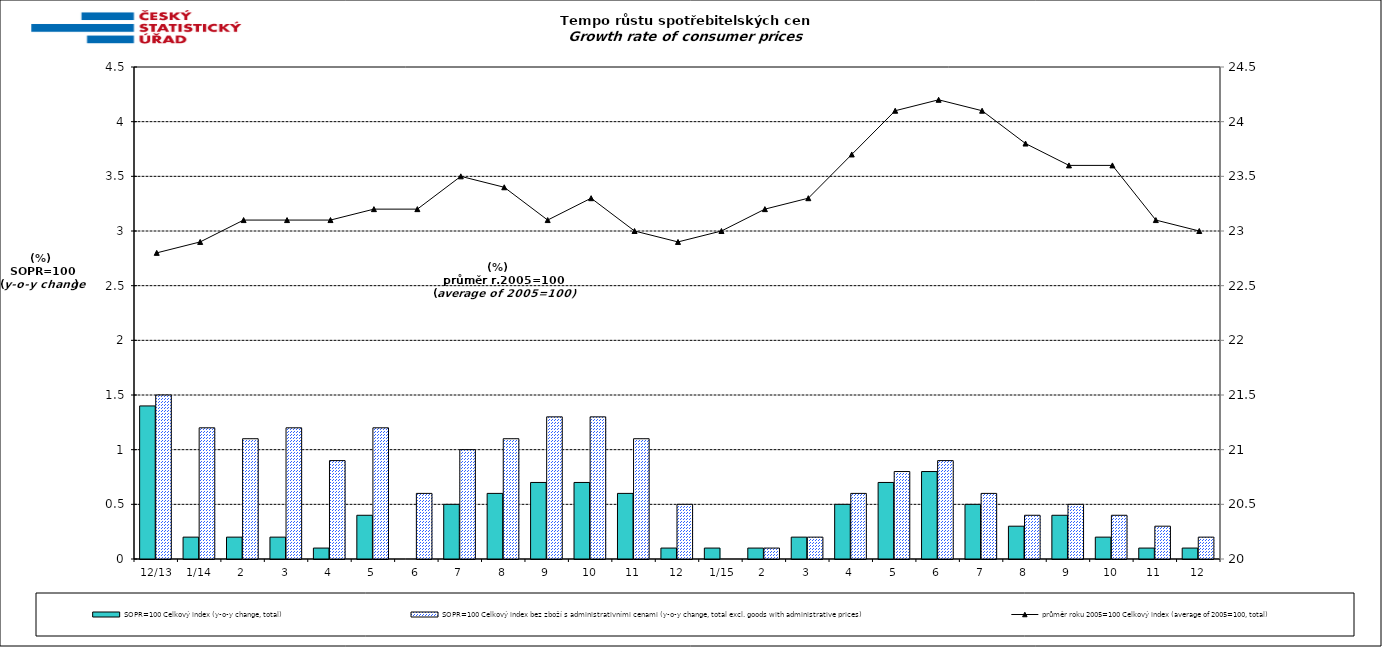
| Category | SOPR=100 Celkový index (y-o-y change, total) | SOPR=100 Celkový index bez zboží s administrativními cenami (y-o-y change, total excl. goods with administrative prices)  |
|---|---|---|
|  12/13 | 1.4 | 1.5 |
| 1/14 | 0.2 | 1.2 |
| 2 | 0.2 | 1.1 |
| 3 | 0.2 | 1.2 |
| 4 | 0.1 | 0.9 |
| 5 | 0.4 | 1.2 |
| 6 | 0 | 0.6 |
| 7 | 0.5 | 1 |
| 8 | 0.6 | 1.1 |
| 9 | 0.7 | 1.3 |
| 10 | 0.7 | 1.3 |
| 11 | 0.6 | 1.1 |
| 12 | 0.1 | 0.5 |
|  1/15 | 0.1 | 0 |
| 2 | 0.1 | 0.1 |
| 3 | 0.2 | 0.2 |
| 4 | 0.5 | 0.6 |
| 5 | 0.7 | 0.8 |
| 6 | 0.8 | 0.9 |
| 7 | 0.5 | 0.6 |
| 8 | 0.3 | 0.4 |
| 9 | 0.4 | 0.5 |
| 10 | 0.2 | 0.4 |
| 11 | 0.1 | 0.3 |
| 12 | 0.1 | 0.2 |